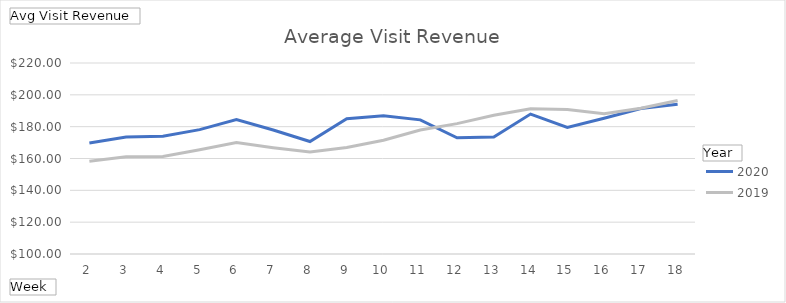
| Category | 2020 | 2019 |
|---|---|---|
| 2 | 169.791 | 158.283 |
| 3 | 173.501 | 161.116 |
| 4 | 173.916 | 161.323 |
| 5 | 178.124 | 165.478 |
| 6 | 184.495 | 169.968 |
| 7 | 177.883 | 166.807 |
| 8 | 170.655 | 164.054 |
| 9 | 184.962 | 166.934 |
| 10 | 186.874 | 171.453 |
| 11 | 184.287 | 177.874 |
| 12 | 173.005 | 181.908 |
| 13 | 173.565 | 187.154 |
| 14 | 187.924 | 191.258 |
| 15 | 179.541 | 190.742 |
| 16 | 185.321 | 188.099 |
| 17 | 191.391 | 191.578 |
| 18 | 194.013 | 196.494 |